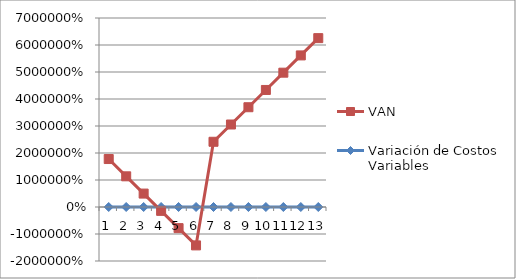
| Category | Variación de Costos Variables | VAN |
|---|---|---|
| 0 | 0.05 | 17761.334 |
| 1 | 0.1 | 11364.24 |
| 2 | 0.15 | 4967.146 |
| 3 | 0.2 | -1429.947 |
| 4 | 0.25 | -7827.041 |
| 5 | 0.3 | -14224.135 |
| 6 | 0 | 24158.428 |
| 7 | -0.05 | 30555.521 |
| 8 | -0.1 | 36952.615 |
| 9 | -0.15 | 43349.709 |
| 10 | -0.2 | 49746.803 |
| 11 | -0.25 | 56143.896 |
| 12 | -0.3 | 62540.99 |